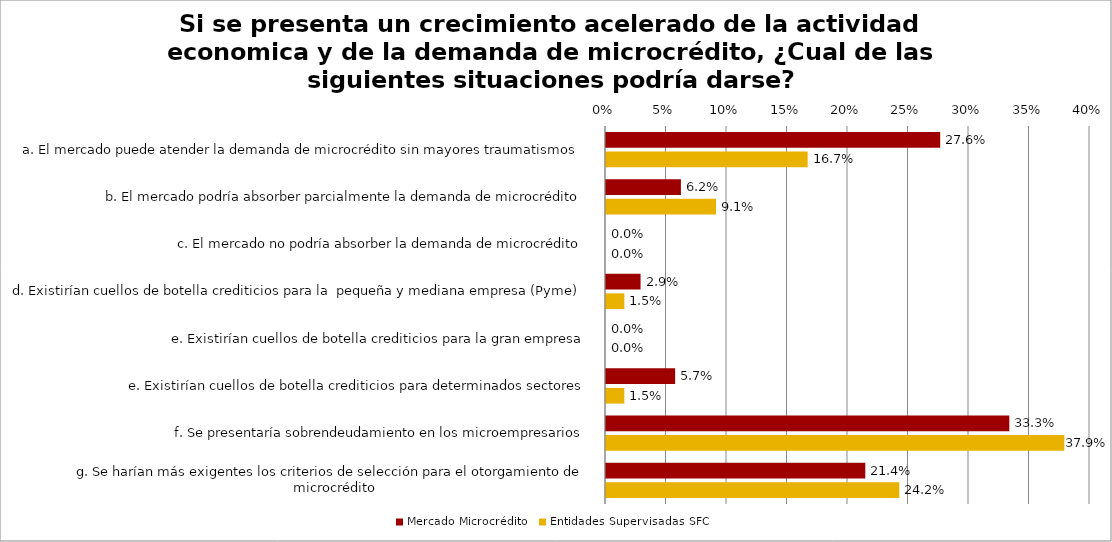
| Category | Mercado Microcrédito | Entidades Supervisadas SFC |
|---|---|---|
| a. El mercado puede atender la demanda de microcrédito sin mayores traumatismos | 0.276 | 0.167 |
| b. El mercado podría absorber parcialmente la demanda de microcrédito | 0.062 | 0.091 |
| c. El mercado no podría absorber la demanda de microcrédito | 0 | 0 |
| d. Existirían cuellos de botella crediticios para la  pequeña y mediana empresa (Pyme) | 0.029 | 0.015 |
| e. Existirían cuellos de botella crediticios para la gran empresa | 0 | 0 |
| e. Existirían cuellos de botella crediticios para determinados sectores | 0.057 | 0.015 |
| f. Se presentaría sobrendeudamiento en los microempresarios | 0.333 | 0.379 |
| g. Se harían más exigentes los criterios de selección para el otorgamiento de microcrédito | 0.214 | 0.242 |